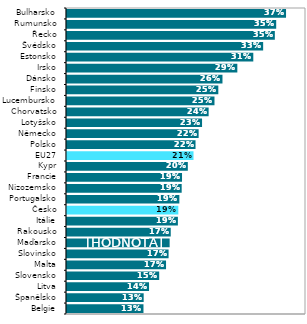
| Category | Series 0 |
|---|---|
| Belgie | 0.128 |
| Španělsko | 0.128 |
| Litva | 0.137 |
| Slovensko | 0.154 |
| Malta | 0.166 |
| Slovinsko | 0.17 |
| Maďarsko | 0.172 |
| Rakousko | 0.174 |
| Itálie | 0.186 |
| Česko | 0.186 |
| Portugalsko | 0.188 |
| Nizozemsko | 0.192 |
| Francie | 0.193 |
| Kypr | 0.202 |
| EU27 | 0.212 |
| Polsko | 0.215 |
| Německo | 0.22 |
| Lotyšsko | 0.226 |
| Chorvatsko | 0.237 |
| Lucembursko | 0.247 |
| Finsko | 0.253 |
| Dánsko | 0.26 |
| Irsko | 0.285 |
| Estonsko | 0.312 |
| Švédsko | 0.328 |
| Řecko | 0.348 |
| Rumunsko | 0.35 |
| Bulharsko | 0.367 |